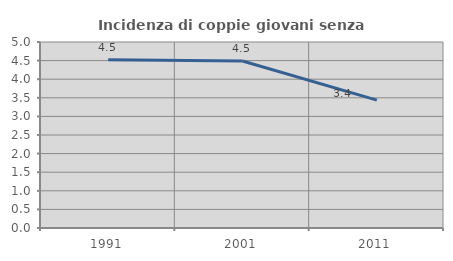
| Category | Incidenza di coppie giovani senza figli |
|---|---|
| 1991.0 | 4.52 |
| 2001.0 | 4.491 |
| 2011.0 | 3.438 |